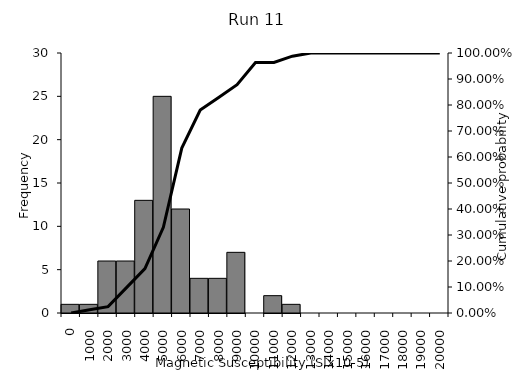
| Category | Series 1 |
|---|---|
| 0.0 | 1 |
| 1000.0 | 1 |
| 2000.0 | 6 |
| 3000.0 | 6 |
| 4000.0 | 13 |
| 5000.0 | 25 |
| 6000.0 | 12 |
| 7000.0 | 4 |
| 8000.0 | 4 |
| 9000.0 | 7 |
| 10000.0 | 0 |
| 11000.0 | 2 |
| 12000.0 | 1 |
| 13000.0 | 0 |
| 14000.0 | 0 |
| 15000.0 | 0 |
| 16000.0 | 0 |
| 17000.0 | 0 |
| 18000.0 | 0 |
| 19000.0 | 0 |
| 20000.0 | 0 |